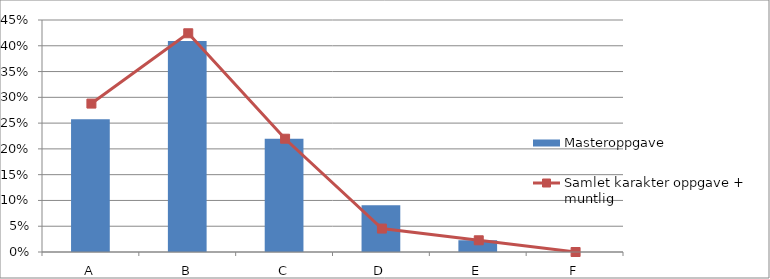
| Category | Masteroppgave |
|---|---|
| A | 0.258 |
| B | 0.409 |
| C | 0.22 |
| D | 0.091 |
| E | 0.023 |
| F | 0 |